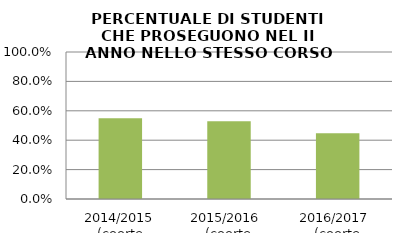
| Category | 2014/2015 (coorte 2013/14) 2015/2016  (coorte 2014/15) 2016/2017  (coorte 2015/16) |
|---|---|
| 2014/2015 (coorte 2013/14) | 0.549 |
| 2015/2016  (coorte 2014/15) | 0.529 |
| 2016/2017  (coorte 2015/16) | 0.448 |